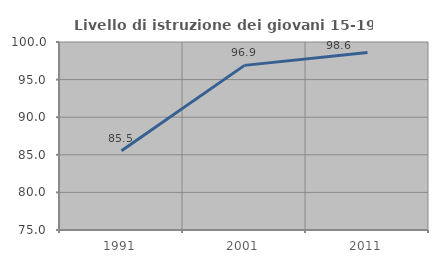
| Category | Livello di istruzione dei giovani 15-19 anni |
|---|---|
| 1991.0 | 85.542 |
| 2001.0 | 96.891 |
| 2011.0 | 98.601 |